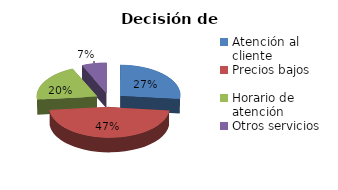
| Category | Participación de mercado |
|---|---|
| Atención al cliente | 0.267 |
| Precios bajos | 0.467 |
| Horario de atención | 0.2 |
| Otros servicios | 0.067 |